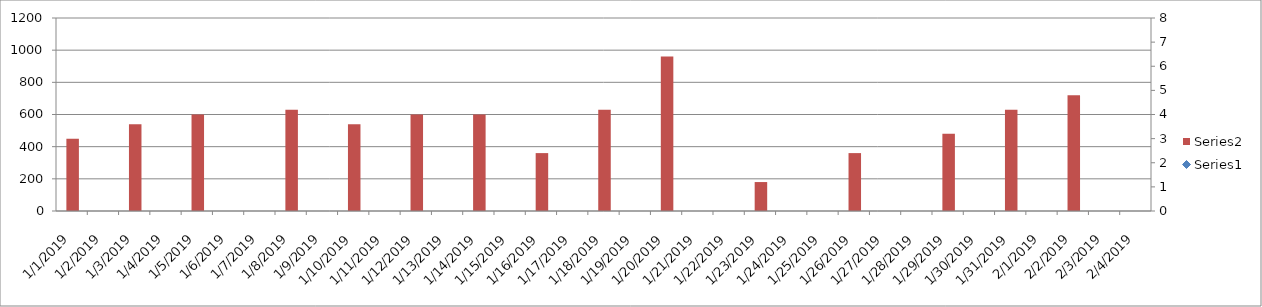
| Category | Series 1 |
|---|---|
| 1/1/19 | 450 |
| 1/2/19 | 0 |
| 1/3/19 | 540 |
| 1/4/19 | 0 |
| 1/5/19 | 600 |
| 1/6/19 | 0 |
| 1/7/19 | 0 |
| 1/8/19 | 630 |
| 1/9/19 | 0 |
| 1/10/19 | 540 |
| 1/11/19 | 0 |
| 1/12/19 | 600 |
| 1/13/19 | 0 |
| 1/14/19 | 600 |
| 1/15/19 | 0 |
| 1/16/19 | 360 |
| 1/17/19 | 0 |
| 1/18/19 | 630 |
| 1/19/19 | 0 |
| 1/20/19 | 960 |
| 1/21/19 | 0 |
| 1/22/19 | 0 |
| 1/23/19 | 180 |
| 1/24/19 | 0 |
| 1/25/19 | 0 |
| 1/26/19 | 360 |
| 1/27/19 | 0 |
| 1/28/19 | 0 |
| 1/29/19 | 480 |
| 1/30/19 | 0 |
| 1/31/19 | 630 |
| 2/1/19 | 0 |
| 2/2/19 | 720 |
| 2/3/19 | 0 |
| 2/4/19 | 0 |